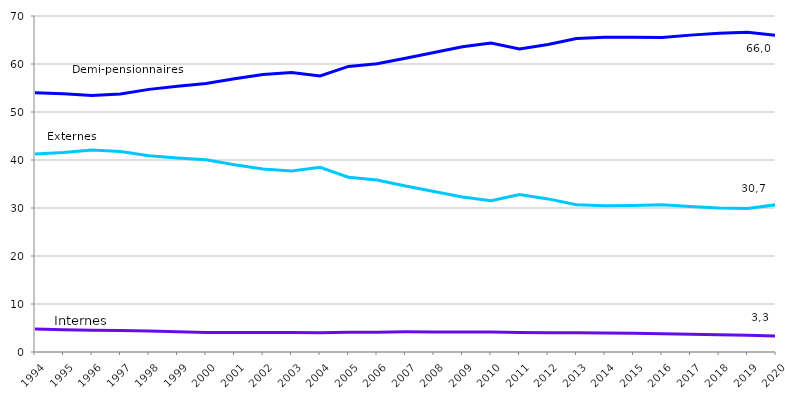
| Category | Demi-pensionnaires | Externes | Internes |
|---|---|---|---|
| 1994.0 | 53.992 | 41.231 | 4.777 |
| 1995.0 | 53.819 | 41.554 | 4.627 |
| 1996.0 | 53.416 | 42.077 | 4.507 |
| 1997.0 | 53.752 | 41.793 | 4.455 |
| 1998.0 | 54.714 | 40.896 | 4.39 |
| 1999.0 | 55.364 | 40.421 | 4.215 |
| 2000.0 | 55.923 | 40.038 | 4.039 |
| 2001.0 | 56.94 | 39.013 | 4.047 |
| 2002.0 | 57.793 | 38.139 | 4.068 |
| 2003.0 | 58.236 | 37.723 | 4.041 |
| 2004.0 | 57.495 | 38.472 | 4.034 |
| 2005.0 | 59.494 | 36.415 | 4.091 |
| 2006.0 | 60.065 | 35.816 | 4.119 |
| 2007.0 | 61.214 | 34.577 | 4.209 |
| 2008.0 | 62.406 | 33.42 | 4.173 |
| 2009.0 | 63.579 | 32.28 | 4.141 |
| 2010.0 | 64.362 | 31.493 | 4.145 |
| 2011.0 | 63.143 | 32.788 | 4.069 |
| 2012.0 | 64.076 | 31.896 | 4.028 |
| 2013.0 | 65.295 | 30.69 | 4.014 |
| 2014.0 | 65.571 | 30.478 | 3.951 |
| 2015.0 | 65.574 | 30.524 | 3.902 |
| 2016.0 | 65.538 | 30.657 | 3.805 |
| 2017.0 | 66.015 | 30.306 | 3.679 |
| 2018.0 | 66.4 | 30 | 3.6 |
| 2019.0 | 66.6 | 29.9 | 3.5 |
| 2020.0 | 65.99 | 30.68 | 3.33 |